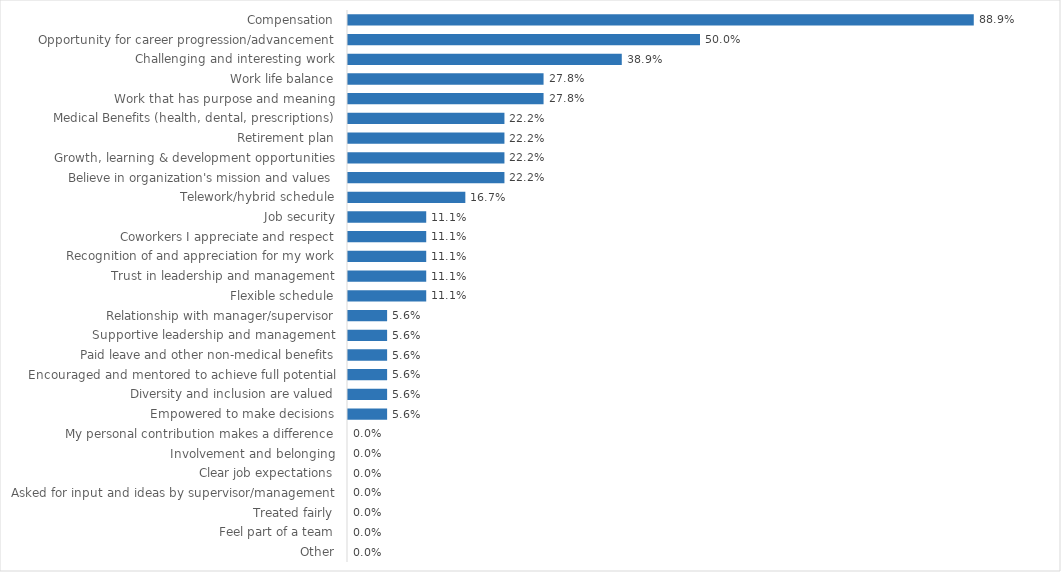
| Category | Public Utility Commission |
|---|---|
| Compensation | 0.889 |
| Opportunity for career progression/advancement | 0.5 |
| Challenging and interesting work | 0.389 |
| Work life balance | 0.278 |
| Work that has purpose and meaning | 0.278 |
| Medical Benefits (health, dental, prescriptions) | 0.222 |
| Retirement plan | 0.222 |
| Growth, learning & development opportunities | 0.222 |
| Believe in organization's mission and values | 0.222 |
| Telework/hybrid schedule | 0.167 |
| Job security | 0.111 |
| Coworkers I appreciate and respect | 0.111 |
| Recognition of and appreciation for my work | 0.111 |
| Trust in leadership and management | 0.111 |
| Flexible schedule | 0.111 |
| Relationship with manager/supervisor | 0.056 |
| Supportive leadership and management | 0.056 |
| Paid leave and other non-medical benefits | 0.056 |
| Encouraged and mentored to achieve full potential | 0.056 |
| Diversity and inclusion are valued | 0.056 |
| Empowered to make decisions | 0.056 |
| My personal contribution makes a difference | 0 |
| Involvement and belonging | 0 |
| Clear job expectations | 0 |
| Asked for input and ideas by supervisor/management | 0 |
| Treated fairly | 0 |
| Feel part of a team | 0 |
| Other | 0 |